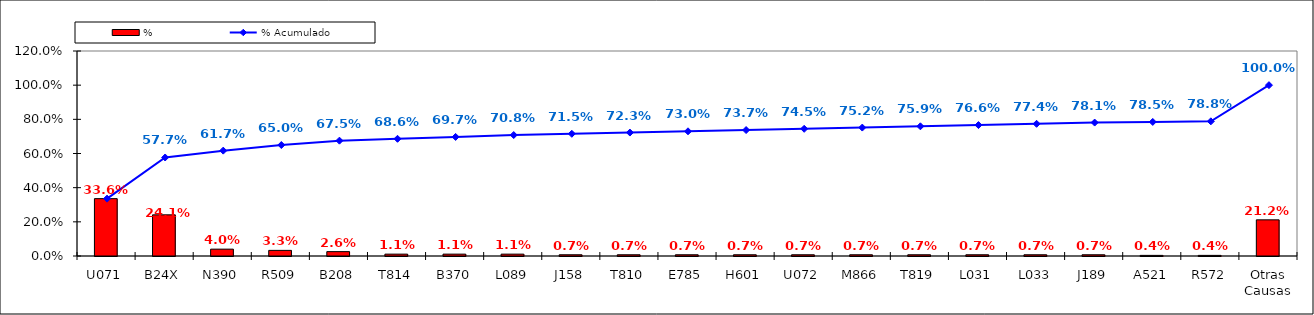
| Category | % |
|---|---|
| U071 | 0.336 |
| B24X | 0.241 |
| N390 | 0.04 |
| R509 | 0.033 |
| B208 | 0.026 |
| T814 | 0.011 |
| B370 | 0.011 |
| L089 | 0.011 |
| J158 | 0.007 |
| T810 | 0.007 |
| E785 | 0.007 |
| H601 | 0.007 |
| U072 | 0.007 |
| M866 | 0.007 |
| T819 | 0.007 |
| L031 | 0.007 |
| L033 | 0.007 |
| J189 | 0.007 |
| A521 | 0.004 |
| R572 | 0.004 |
| Otras Causas | 0.212 |